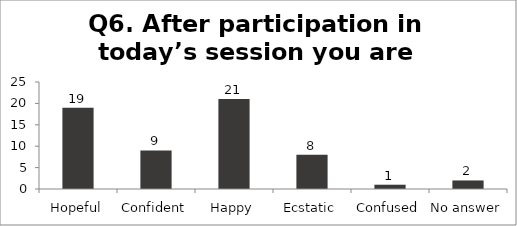
| Category | Q6. After participation in today’s session you are feeling? |
|---|---|
| Hopeful | 19 |
| Confident | 9 |
| Happy | 21 |
| Ecstatic | 8 |
| Confused | 1 |
| No answer | 2 |